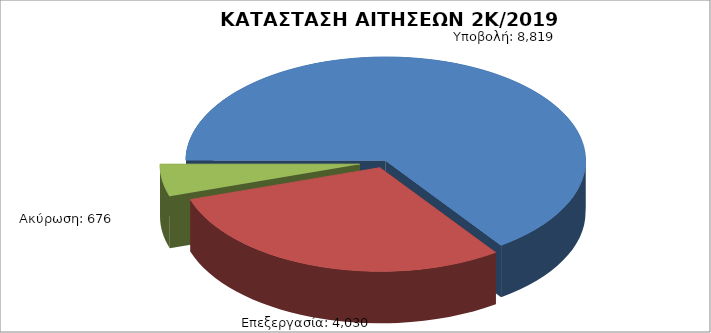
| Category | Series 0 |
|---|---|
| Υποβολή: | 8819 |
| Επεξεργασία: | 4030 |
| Ακύρωση: | 676 |